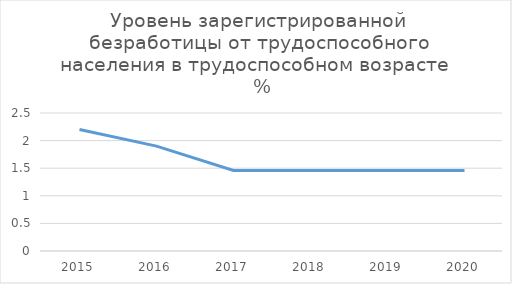
| Category | Уровень зарегистрированной безработицы от трудоспособного населения в трудоспособном возрасте |
|---|---|
| 2015.0 | 2.2 |
| 2016.0 | 1.9 |
| 2017.0 | 1.46 |
| 2018.0 | 1.46 |
| 2019.0 | 1.46 |
| 2020.0 | 1.46 |